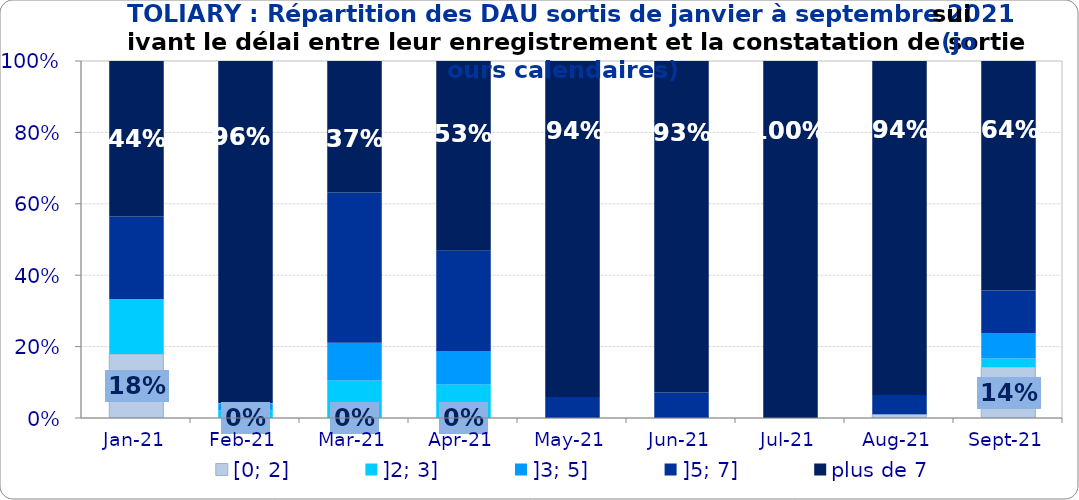
| Category | [0; 2] | ]2; 3] | ]3; 5] | ]5; 7] | plus de 7 |
|---|---|---|---|---|---|
| 2021-01-01 | 0.179 | 0.154 | 0 | 0.231 | 0.436 |
| 2021-02-01 | 0 | 0.021 | 0.021 | 0 | 0.958 |
| 2021-03-01 | 0 | 0.105 | 0.105 | 0.421 | 0.368 |
| 2021-04-01 | 0 | 0.094 | 0.094 | 0.281 | 0.531 |
| 2021-05-01 | 0 | 0 | 0 | 0.059 | 0.941 |
| 2021-06-01 | 0 | 0 | 0 | 0.071 | 0.929 |
| 2021-07-01 | 0 | 0 | 0 | 0 | 1 |
| 2021-08-01 | 0.011 | 0 | 0 | 0.054 | 0.935 |
| 2021-09-01 | 0.143 | 0.024 | 0.071 | 0.119 | 0.643 |